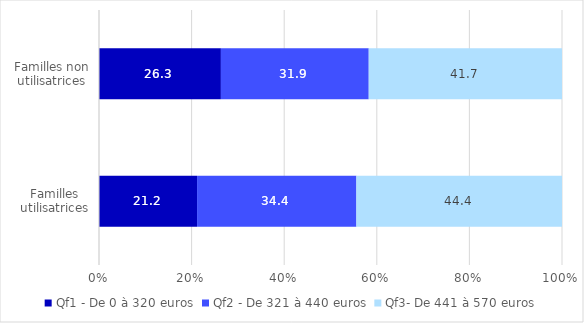
| Category | Qf1 - De 0 à 320 euros | Qf2 - De 321 à 440 euros | Qf3- De 441 à 570 euros |
|---|---|---|---|
| Familles utilisatrices | 21.178 | 34.415 | 44.406 |
| Familles non utilisatrices | 26.329 | 31.928 | 41.743 |